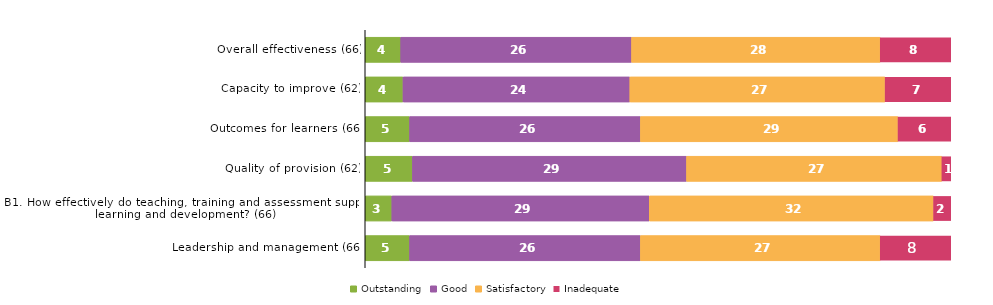
| Category | Outstanding | Good | Satisfactory | Inadequate |
|---|---|---|---|---|
| Overall effectiveness (66) | 4 | 26 | 28 | 8 |
| Capacity to improve (62) | 4 | 24 | 27 | 7 |
| Outcomes for learners (66) | 5 | 26 | 29 | 6 |
| Quality of provision (62) | 5 | 29 | 27 | 1 |
| B1. How effectively do teaching, training and assessment support learning and development? (66) | 3 | 29 | 32 | 2 |
| Leadership and management (66) | 5 | 26 | 27 | 8 |